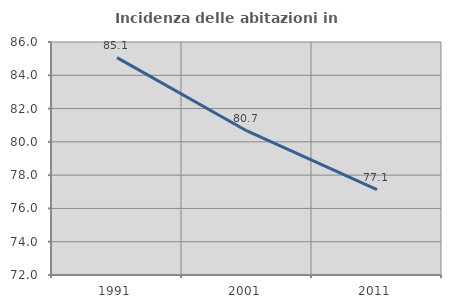
| Category | Incidenza delle abitazioni in proprietà  |
|---|---|
| 1991.0 | 85.064 |
| 2001.0 | 80.656 |
| 2011.0 | 77.133 |